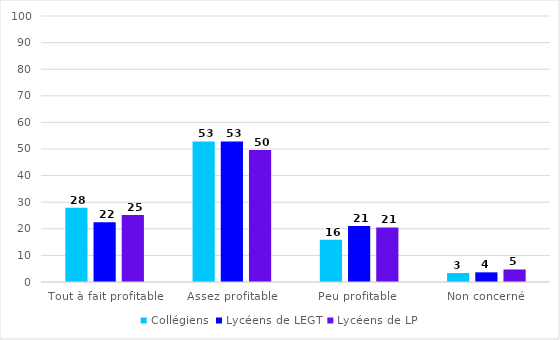
| Category | Collégiens | Lycéens de LEGT | Lycéens de LP |
|---|---|---|---|
| Tout à fait profitable | 27.9 | 22.44 | 25.19 |
| Assez profitable | 52.86 | 52.85 | 49.6 |
| Peu profitable  | 15.87 | 21.07 | 20.5 |
| Non concerné | 3.37 | 3.63 | 4.71 |